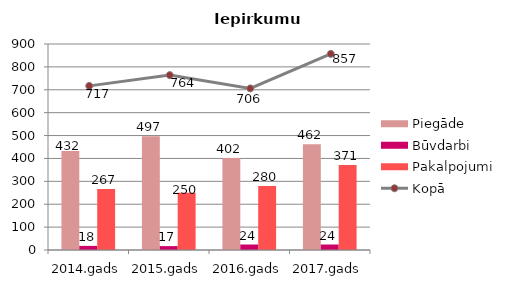
| Category | Piegāde | Būvdarbi | Pakalpojumi |
|---|---|---|---|
| 2014.gads | 432 | 18 | 267 |
| 2015.gads | 497 | 17 | 250 |
| 2016.gads | 402 | 24 | 280 |
| 2017.gads | 462 | 24 | 371 |